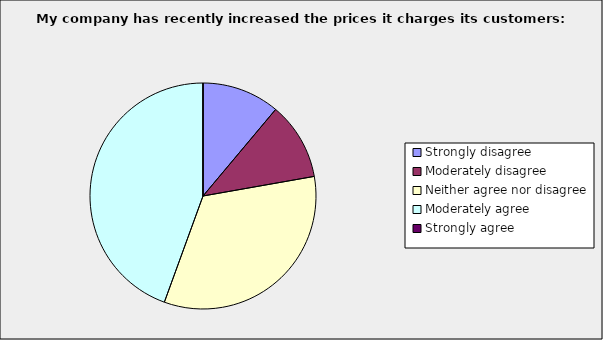
| Category | Series 0 |
|---|---|
| Strongly disagree | 0.111 |
| Moderately disagree | 0.111 |
| Neither agree nor disagree | 0.333 |
| Moderately agree | 0.444 |
| Strongly agree | 0 |